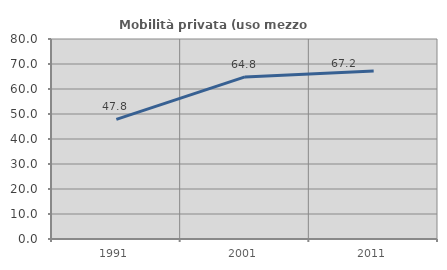
| Category | Mobilità privata (uso mezzo privato) |
|---|---|
| 1991.0 | 47.841 |
| 2001.0 | 64.845 |
| 2011.0 | 67.211 |